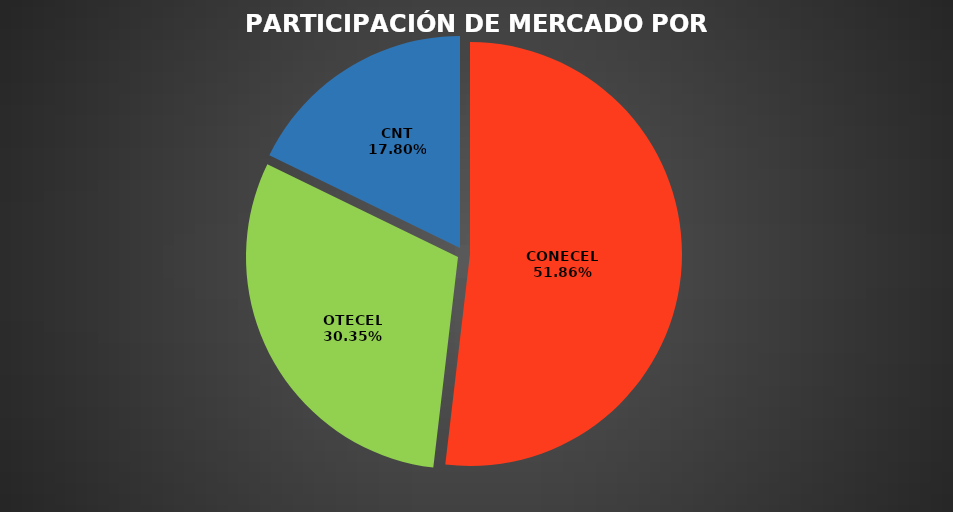
| Category | Nov 2023 |
|---|---|
| CONECEL | 9399776 |
| OTECEL | 5500199 |
| CNT | 3225513 |